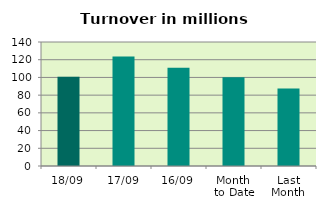
| Category | Series 0 |
|---|---|
| 18/09 | 100.823 |
| 17/09 | 123.706 |
| 16/09 | 110.804 |
| Month 
to Date | 100.278 |
| Last
Month | 87.619 |